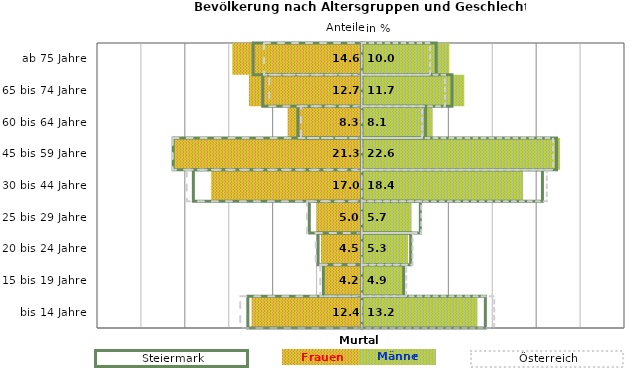
| Category | Frauen | Männer | Frauen Spalte2 | Männer Spalte2 | Frauen Spalte3 | Männer Spalte3 |
|---|---|---|---|---|---|---|
| bis 14 Jahre | -12.4 | 13.2 | 14.1 | -13 | -13.8 | 15.1 |
| 15 bis 19 Jahre | -4.2 | 4.9 | 4.8 | -4.4 | -4.7 | 5.1 |
| 20 bis 24 Jahre | -4.5 | 5.3 | 5.6 | -5 | -5.2 | 5.8 |
| 25 bis 29 Jahre | -5 | 5.7 | 6.7 | -6 | -6.2 | 6.8 |
| 30 bis 44 Jahre | -17 | 18.4 | 20.6 | -19.2 | -19.9 | 21.1 |
| 45 bis 59 Jahre | -21.3 | 22.6 | 22.2 | -21.5 | -21.5 | 21.8 |
| 60 bis 64 Jahre | -8.3 | 8.1 | 7.3 | -7.3 | -6.9 | 6.9 |
| 65 bis 74 Jahre | -12.7 | 11.7 | 10.3 | -11.3 | -10.5 | 9.5 |
| ab 75 Jahre | -14.6 | 10 | 8.5 | -12.4 | -11.1 | 7.8 |